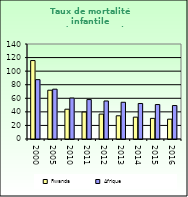
| Category | Rwanda | Afrique                        |
|---|---|---|
| 2000.0 | 115.6 | 87.462 |
| 2005.0 | 71.9 | 73.418 |
| 2010.0 | 43.9 | 60.345 |
| 2011.0 | 39.7 | 58.107 |
| 2012.0 | 36.7 | 56.032 |
| 2013.0 | 34.2 | 54.131 |
| 2014.0 | 32.2 | 52.336 |
| 2015.0 | 30.4 | 50.754 |
| 2016.0 | 29.2 | 49.283 |